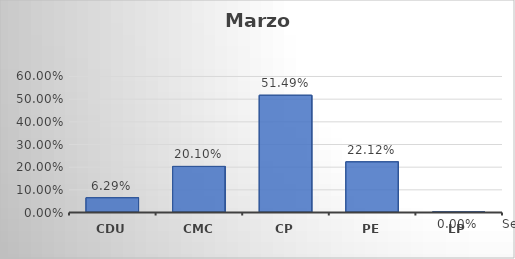
| Category | Series 0 |
|---|---|
| CDU | 0.063 |
| CMC | 0.201 |
| CP | 0.515 |
| PE | 0.221 |
| LP | 0 |